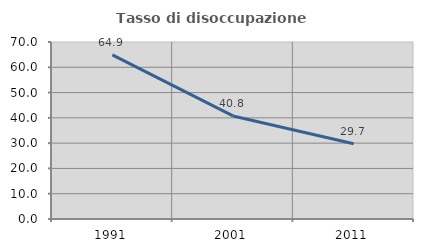
| Category | Tasso di disoccupazione giovanile  |
|---|---|
| 1991.0 | 64.921 |
| 2001.0 | 40.753 |
| 2011.0 | 29.734 |